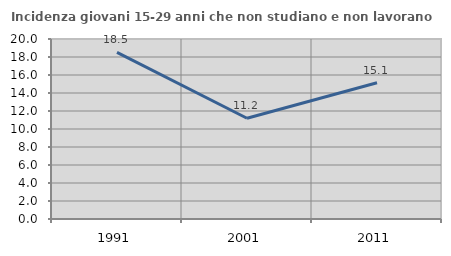
| Category | Incidenza giovani 15-29 anni che non studiano e non lavorano  |
|---|---|
| 1991.0 | 18.511 |
| 2001.0 | 11.19 |
| 2011.0 | 15.136 |